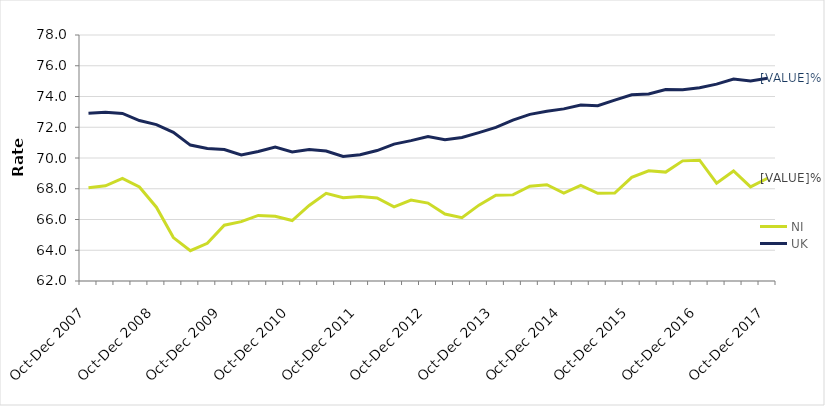
| Category | NI | UK |
|---|---|---|
| Oct-Dec 2007 | 68.059 | 72.909 |
| Jan-Mar 2008 | 68.193 | 72.976 |
| Apr-Jun 2008 | 68.674 | 72.9 |
| Jul-Sep 2008 | 68.114 | 72.436 |
| Oct-Dec 2008 | 66.798 | 72.174 |
| Jan-Mar 2009 | 64.822 | 71.673 |
| Apr-Jun 2009 | 63.973 | 70.84 |
| Jul-Sep 2009 | 64.453 | 70.617 |
| Oct-Dec 2009 | 65.629 | 70.552 |
| Jan-Mar 2010 | 65.858 | 70.195 |
| Apr-Jun 2010 | 66.264 | 70.423 |
| Jul-Sep 2010 | 66.205 | 70.705 |
| Oct-Dec 2010 | 65.931 | 70.39 |
| Jan-Mar 2011 | 66.913 | 70.546 |
| Apr-Jun 2011 | 67.699 | 70.45 |
| Jul-Sep 2011 | 67.411 | 70.095 |
| Oct-Dec 2011 | 67.496 | 70.211 |
| Jan-Mar 2012 | 67.397 | 70.483 |
| Apr-Jun 2012 | 66.82 | 70.901 |
| Jul-Sep 2012 | 67.268 | 71.128 |
| Oct-Dec 2012 | 67.066 | 71.399 |
| Jan-Mar 2013 | 66.353 | 71.182 |
| Apr-Jun 2013 | 66.116 | 71.333 |
| Jul-Sep 2013 | 66.933 | 71.651 |
| Oct-Dec 2013 | 67.579 | 71.99 |
| Jan-Mar 2014 | 67.602 | 72.466 |
| Apr-Jun 2014 | 68.162 | 72.836 |
| Jul-Sep 2014 | 68.262 | 73.036 |
| Oct-Dec 2014 | 67.714 | 73.196 |
| Jan-Mar 2015 | 68.214 | 73.449 |
| Apr-Jun 2015 | 67.708 | 73.396 |
| Jul-Sep 2015 | 67.717 | 73.762 |
| Oct-Dec 2015 | 68.739 | 74.112 |
| Jan-Mar 2016 | 69.166 | 74.163 |
| Apr-Jun 2016 | 69.083 | 74.45 |
| Jul-Sep 2016 | 69.813 | 74.433 |
| Oct-Dec 2016 | 69.856 | 74.568 |
| Jan-Mar 2017 | 68.362 | 74.803 |
| Apr-Jun 2017 | 69.155 | 75.132 |
| Jul-Sep 2017 | 68.122 | 75.012 |
| Oct-Dec 2017 | 68.685 | 75.18 |